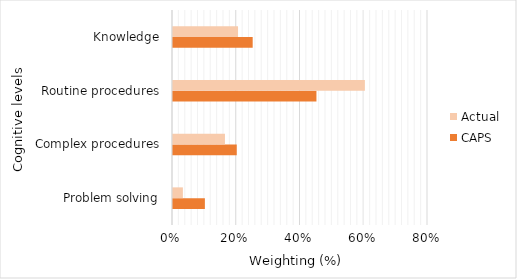
| Category | CAPS | Actual |
|---|---|---|
| Problem solving | 0.1 | 0.031 |
| Complex procedures | 0.2 | 0.163 |
| Routine procedures | 0.45 | 0.602 |
| Knowledge | 0.25 | 0.204 |